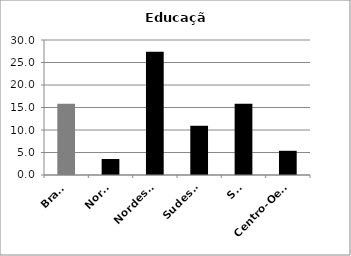
| Category | Educação |
|---|---|
| Brasil | 15.86 |
| Norte | 3.55 |
| Nordeste | 27.39 |
| Sudeste | 10.94 |
| Sul | 15.84 |
| Centro-Oeste | 5.38 |